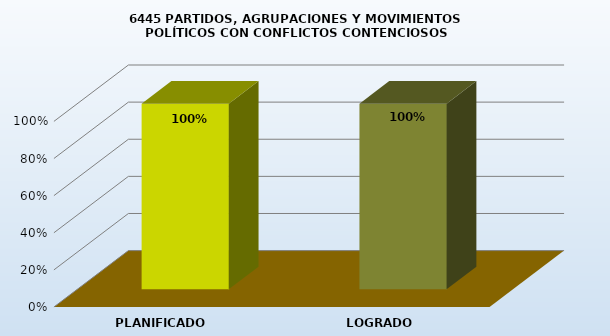
| Category | 6445 |
|---|---|
| PLANIFICADO | 1 |
| LOGRADO | 1 |